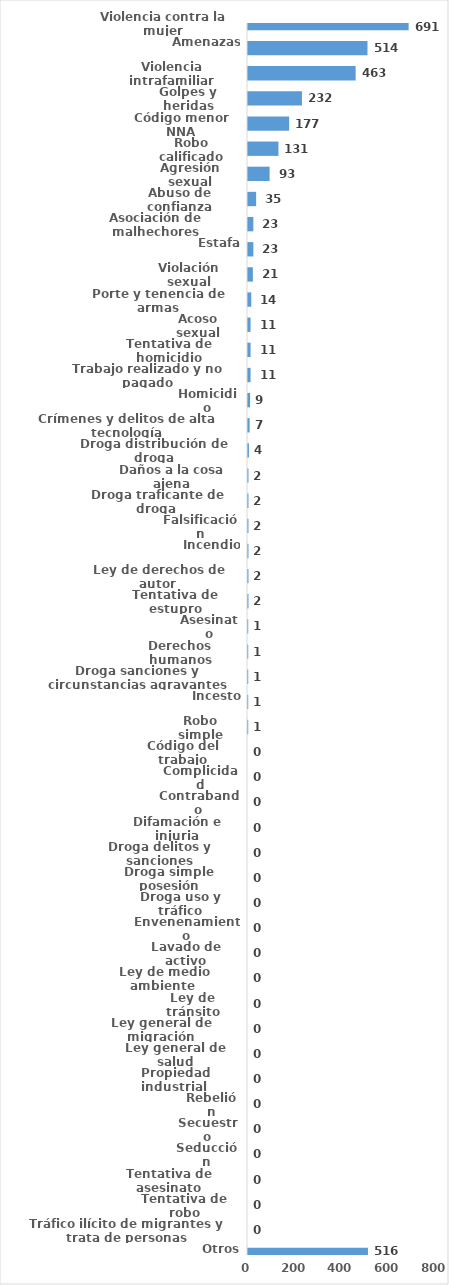
| Category | Series 0 |
|---|---|
| Violencia contra la mujer | 691 |
| Amenazas | 514 |
| Violencia intrafamiliar | 463 |
| Golpes y heridas | 232 |
| Código menor NNA | 177 |
| Robo calificado | 131 |
| Agresión sexual | 93 |
| Abuso de confianza | 35 |
| Asociación de malhechores | 23 |
| Estafa | 23 |
| Violación sexual | 21 |
| Porte y tenencia de armas | 14 |
| Acoso sexual | 11 |
| Tentativa de homicidio | 11 |
| Trabajo realizado y no pagado | 11 |
| Homicidio | 9 |
| Crímenes y delitos de alta tecnología | 7 |
| Droga distribución de droga | 4 |
| Daños a la cosa ajena | 2 |
| Droga traficante de droga  | 2 |
| Falsificación | 2 |
| Incendio | 2 |
| Ley de derechos de autor  | 2 |
| Tentativa de estupro | 2 |
| Asesinato | 1 |
| Derechos humanos | 1 |
| Droga sanciones y circunstancias agravantes | 1 |
| Incesto | 1 |
| Robo simple | 1 |
| Código del trabajo | 0 |
| Complicidad | 0 |
| Contrabando | 0 |
| Difamación e injuria | 0 |
| Droga delitos y sanciones | 0 |
| Droga simple posesión | 0 |
| Droga uso y tráfico | 0 |
| Envenenamiento | 0 |
| Lavado de activo | 0 |
| Ley de medio ambiente  | 0 |
| Ley de tránsito | 0 |
| Ley general de migración | 0 |
| Ley general de salud | 0 |
| Propiedad industrial  | 0 |
| Rebelión | 0 |
| Secuestro | 0 |
| Seducción | 0 |
| Tentativa de asesinato | 0 |
| Tentativa de robo | 0 |
| Tráfico ilícito de migrantes y trata de personas | 0 |
| Otros | 516 |